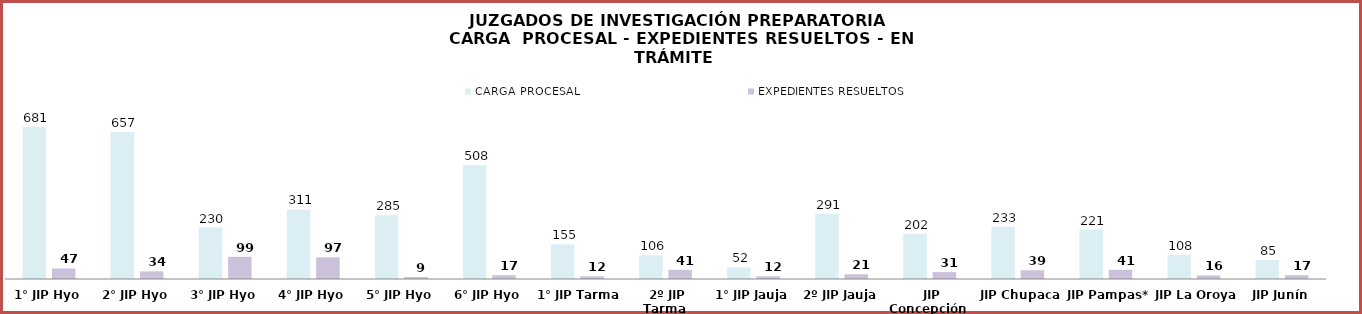
| Category | CARGA PROCESAL | EXPEDIENTES RESUELTOS |
|---|---|---|
| 1° JIP Hyo | 681 | 47 |
| 2° JIP Hyo | 657 | 34 |
| 3° JIP Hyo | 230 | 99 |
| 4° JIP Hyo | 311 | 97 |
| 5° JIP Hyo | 285 | 9 |
| 6° JIP Hyo | 508 | 17 |
| 1° JIP Tarma | 155 | 12 |
| 2º JIP Tarma | 106 | 41 |
| 1° JIP Jauja | 52 | 12 |
| 2º JIP Jauja | 291 | 21 |
| JIP Concepción | 202 | 31 |
| JIP Chupaca | 233 | 39 |
| JIP Pampas*  | 221 | 41 |
| JIP La Oroya | 108 | 16 |
| JIP Junín | 85 | 17 |